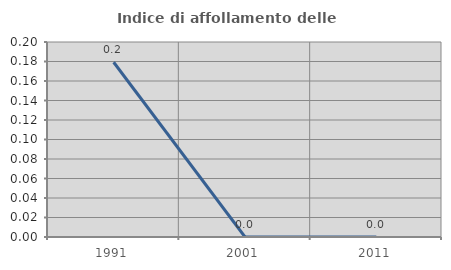
| Category | Indice di affollamento delle abitazioni  |
|---|---|
| 1991.0 | 0.179 |
| 2001.0 | 0 |
| 2011.0 | 0 |